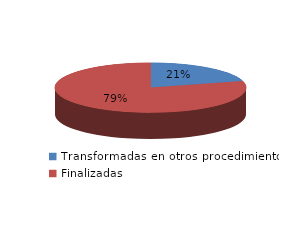
| Category | Series 0 |
|---|---|
| Transformadas en otros procedimientos | 1217 |
| Finalizadas | 4687 |